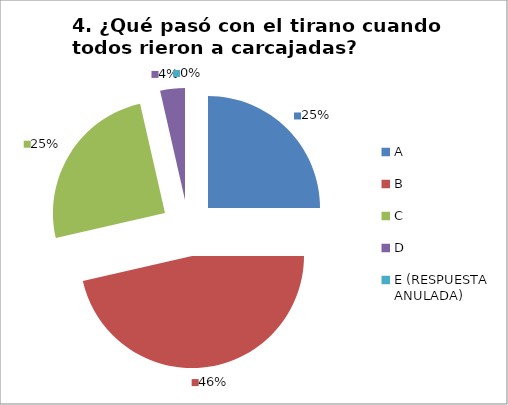
| Category | CANTIDAD DE RESPUESTAS PREGUNTA (4) | PORCENTAJE |
|---|---|---|
| A | 7 | 0.25 |
| B | 13 | 0.464 |
| C | 7 | 0.25 |
| D | 1 | 0.036 |
| E (RESPUESTA ANULADA) | 0 | 0 |